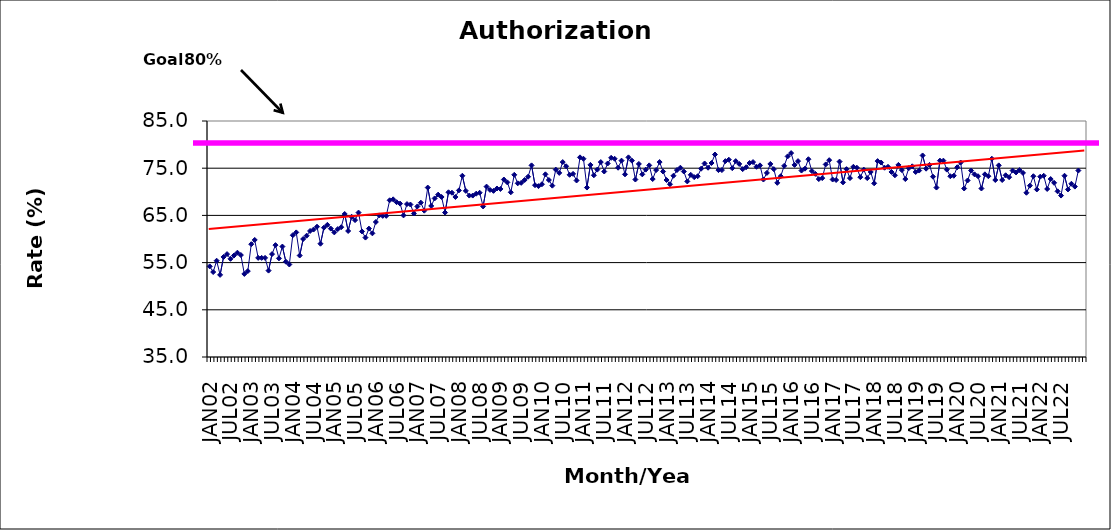
| Category | Series 0 |
|---|---|
| JAN02 | 54.2 |
| FEB02 | 53 |
| MAR02 | 55.4 |
| APR02 | 52.4 |
| MAY02 | 56.2 |
| JUN02 | 56.8 |
| JUL02 | 55.8 |
| AUG02 | 56.5 |
| SEP02 | 57.1 |
| OCT02 | 56.6 |
| NOV02 | 52.6 |
| DEC02 | 53.2 |
| JAN03 | 58.9 |
| FEB03 | 59.8 |
| MAR03 | 56 |
| APR03 | 56 |
| MAY03 | 56 |
| JUN03 | 53.3 |
| JUL03 | 56.8 |
| AUG03 | 58.7 |
| SEP03 | 55.9 |
| OCT03 | 58.4 |
| NOV03 | 55.2 |
| DEC03 | 54.6 |
| JAN04 | 60.8 |
| FEB04 | 61.4 |
| MAR04 | 56.5 |
| APR04 | 60 |
| MAY04 | 60.7 |
| JUN04 | 61.7 |
| JUL04 | 62 |
| AUG04 | 62.6 |
| SEP04 | 59 |
| OCT04 | 62.4 |
| NOV04 | 63 |
| DEC04 | 62.2 |
| JAN05 | 61.4 |
| FEB05 | 62.1 |
| MAR05 | 62.5 |
| APR05 | 65.3 |
| MAY05 | 61.7 |
| JUN05 | 64.7 |
| JUL05 | 64 |
| AUG05 | 65.6 |
| SEP05 | 61.6 |
| OCT05 | 60.3 |
| NOV05 | 62.2 |
| DEC05 | 61.2 |
| JAN06 | 63.6 |
| FEB06 | 65 |
| MAR06 | 64.9 |
| APR06 | 64.9 |
| MAY06 | 68.2 |
| JUN06 | 68.4 |
| JUL06 | 67.8 |
| AUG06 | 67.5 |
| SEP06 | 65 |
| OCT06 | 67.4 |
| NOV06 | 67.3 |
| DEC06 | 65.4 |
| JAN07 | 66.9 |
| FEB07 | 67.7 |
| MAR07 | 66 |
| APR07 | 70.9 |
| MAY07 | 67 |
| JUN07 | 68.6 |
| JUL07 | 69.4 |
| AUG07 | 68.9 |
| SEP07 | 65.6 |
| OCT07 | 69.9 |
| NOV07 | 69.8 |
| DEC07 | 68.9 |
| JAN08 | 70.3 |
| FEB08 | 73.4 |
| MAR08 | 70.2 |
| APR08 | 69.2 |
| MAY08 | 69.2 |
| JUN08 | 69.6 |
| JUL08 | 69.8 |
| AUG08 | 66.9 |
| SEP08 | 71.1 |
| OCT08 | 70.4 |
| NOV08 | 70.2 |
| DEC08 | 70.7 |
| JAN09 | 70.6 |
| FEB09 | 72.6 |
| MAR09 | 72 |
| APR09 | 69.9 |
| MAY09 | 73.6 |
| JUN09 | 71.8 |
| JUL09 | 71.9 |
| AUG09 | 72.5 |
| SEP09 | 73.2 |
| OCT09 | 75.6 |
| NOV09 | 71.4 |
| DEC09 | 71.2 |
| JAN10 | 71.6 |
| FEB10 | 73.7 |
| MAR10 | 72.5 |
| APR10 | 71.3 |
| MAY10 | 74.7 |
| JUN10 | 74 |
| JUL10 | 76.3 |
| AUG10 | 75.4 |
| SEP10 | 73.6 |
| OCT10 | 73.8 |
| NOV10 | 72.4 |
| DEC10 | 77.3 |
| JAN11 | 77 |
| FEB11 | 70.9 |
| MAR11 | 75.7 |
| APR11 | 73.5 |
| MAY11 | 74.7 |
| JUN11 | 76.3 |
| JUL11 | 74.3 |
| AUG11 | 76 |
| SEP11 | 77.2 |
| OCT11 | 77 |
| NOV11 | 75.1 |
| DEC11 | 76.6 |
| JAN12 | 73.7 |
| FEB12 | 77.3 |
| MAR12 | 76.6 |
| APR12 | 72.6 |
| MAY12 | 75.9 |
| JUN12 | 73.7 |
| JUL12 | 74.7 |
| AUG12 | 75.6 |
| SEP12 | 72.7 |
| OCT12 | 74.6 |
| NOV12 | 76.3 |
| DEC12 | 74.3 |
| JAN13 | 72.5 |
| FEB13 | 71.6 |
| MAR13 | 73.4 |
| APR13 | 74.6 |
| MAY13 | 75.1 |
| JUN13 | 74.3 |
| JUL13 | 72.2 |
| AUG13 | 73.6 |
| SEP13 | 73.1 |
| OCT13 | 73.3 |
| NOV13 | 74.9 |
| DEC13 | 76 |
| JAN14 | 75.1 |
| FEB14 | 76.1 |
| MAR14 | 77.9 |
| APR14 | 74.6 |
| MAY14 | 74.6 |
| JUN14 | 76.5 |
| JUL14 | 76.8 |
| AUG14 | 75 |
| SEP14 | 76.5 |
| OCT14 | 75.9 |
| NOV14 | 74.8 |
| DEC14 | 75.2 |
| JAN15 | 76.1 |
| FEB15 | 76.3 |
| MAR15 | 75.3 |
| APR15 | 75.6 |
| MAY15 | 72.6 |
| JUN15 | 74 |
| JUL15 | 75.9 |
| AUG15 | 74.8 |
| SEP15 | 71.9 |
| OCT15 | 73.3 |
| NOV15 | 75.5 |
| DEC15 | 77.5 |
| JAN16 | 78.2 |
| FEB16 | 75.7 |
| MAR16 | 76.5 |
| APR16 | 74.5 |
| MAY16 | 74.9 |
| JUN16 | 76.9 |
| JUL16 | 74.4 |
| AUG16 | 73.8 |
| SEP16 | 72.7 |
| OCT16 | 72.9 |
| NOV16 | 75.8 |
| DEC16 | 76.7 |
| JAN17 | 72.6 |
| FEB17 | 72.5 |
| MAR17 | 76.4 |
| APR17 | 72 |
| MAY17 | 74.8 |
| JUN17 | 72.9 |
| JUL17 | 75.3 |
| AUG17 | 75.1 |
| SEP17 | 73.1 |
| OCT17 | 74.7 |
| NOV17 | 72.9 |
| DEC17 | 74.2 |
| JAN18 | 71.8 |
| FEB18 | 76.5 |
| MAR18 | 76.2 |
| APR18 | 75.1 |
| MAY18 | 75.3 |
| JUN18 | 74.2 |
| JUL18 | 73.5 |
| AUG18 | 75.7 |
| SEP18 | 74.6 |
| OCT18 | 72.7 |
| NOV18 | 75 |
| DEC18 | 75.4 |
| JAN19 | 74.2 |
| FEB19 | 74.5 |
| MAR19 | 77.7 |
| APR19 | 74.9 |
| MAY19 | 75.7 |
| JUN19 | 73.2 |
| JUL19 | 70.9 |
| AUG19 | 76.6 |
| SEP19 | 76.6 |
| OCT19 | 74.7 |
| NOV19 | 73.3 |
| DEC19 | 73.4 |
| JAN20 | 75.2 |
| FEB20 | 76.2 |
| MAR20 | 70.7 |
| APR20 | 72.4 |
| MAY20 | 74.5 |
| JUN20 | 73.7 |
| JUL20 | 73.3 |
| AUG20 | 70.7 |
| SEP20 | 73.7 |
| OCT20 | 73.3 |
| NOV20 | 77 |
| DEC20 | 72.5 |
| JAN21 | 75.6 |
| FEB21 | 72.5 |
| MAR21 | 73.5 |
| APR21 | 73.1 |
| MAY21 | 74.5 |
| JUN21 | 74.1 |
| JUL21 | 74.6 |
| AUG21 | 74 |
| SEP21 | 69.8 |
| OCT21 | 71.3 |
| NOV21 | 73.3 |
| DEC21 | 70.5 |
| JAN22 | 73.2 |
| FEB22 | 73.4 |
| MAR22 | 70.6 |
| APR22 | 72.7 |
| MAY22 | 71.9 |
| JUN22 | 70.1 |
| JUL22 | 69.2 |
| AUG22 | 73.4 |
| SEP22 | 70.5 |
| OCT22 | 71.7 |
| NOV22 | 71.1 |
| DEC22 | 74.5 |